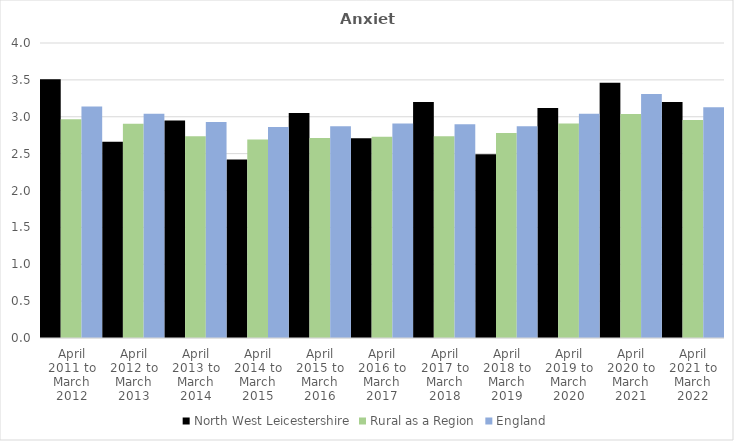
| Category | North West Leicestershire | Rural as a Region | England |
|---|---|---|---|
| April 2011 to March 2012 | 3.51 | 2.967 | 3.14 |
| April 2012 to March 2013 | 2.66 | 2.904 | 3.04 |
| April 2013 to March 2014 | 2.95 | 2.734 | 2.93 |
| April 2014 to March 2015 | 2.42 | 2.691 | 2.86 |
| April 2015 to March 2016 | 3.05 | 2.711 | 2.87 |
| April 2016 to March 2017 | 2.71 | 2.729 | 2.91 |
| April 2017 to March 2018 | 3.2 | 2.736 | 2.9 |
| April 2018 to March 2019 | 2.49 | 2.78 | 2.87 |
| April 2019 to March 2020 | 3.12 | 2.908 | 3.04 |
| April 2020 to March 2021 | 3.46 | 3.036 | 3.31 |
| April 2021 to March 2022 | 3.2 | 2.956 | 3.13 |